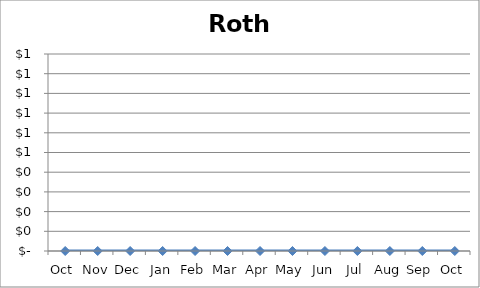
| Category | Roth IRA |
|---|---|
| Oct | 0 |
| Nov | 0 |
| Dec | 0 |
| Jan | 0 |
| Feb | 0 |
| Mar | 0 |
| Apr | 0 |
| May | 0 |
| Jun | 0 |
| Jul | 0 |
| Aug | 0 |
| Sep | 0 |
| Oct | 0 |